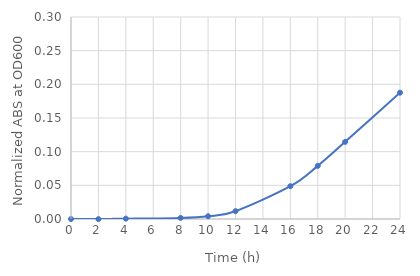
| Category | Series 0 |
|---|---|
| 0.0 | 0 |
| 2.0 | 0 |
| 4.0 | 0.001 |
| 8.0 | 0.002 |
| 10.0 | 0.004 |
| 12.0 | 0.012 |
| 16.0 | 0.049 |
| 18.0 | 0.079 |
| 20.0 | 0.115 |
| 24.0 | 0.188 |